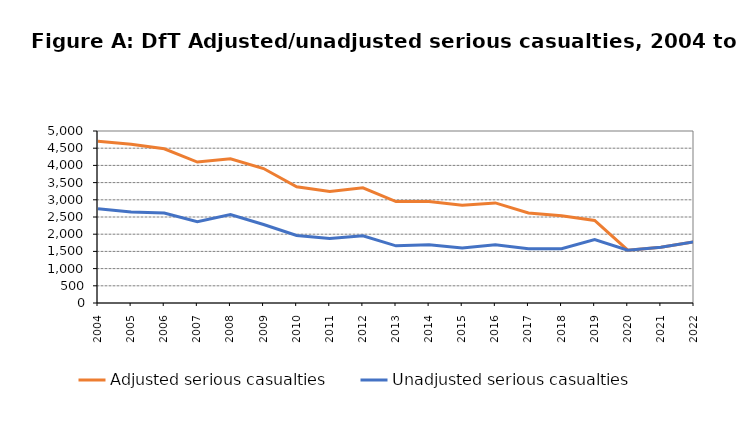
| Category | Adjusted serious casualties | Unadjusted serious casualties |
|---|---|---|
| 2004.0 | 4703 | 2741 |
| 2005.0 | 4613 | 2643 |
| 2006.0 | 4482 | 2614 |
| 2007.0 | 4097 | 2365 |
| 2008.0 | 4195 | 2572 |
| 2009.0 | 3909 | 2281 |
| 2010.0 | 3381 | 1964 |
| 2011.0 | 3244 | 1873 |
| 2012.0 | 3349 | 1956 |
| 2013.0 | 2949 | 1662 |
| 2014.0 | 2949 | 1692 |
| 2015.0 | 2840 | 1597 |
| 2016.0 | 2910 | 1693 |
| 2017.0 | 2617 | 1578 |
| 2018.0 | 2538 | 1580 |
| 2019.0 | 2401 | 1843 |
| 2020.0 | 1535 | 1535 |
| 2021.0 | 1618 | 1618 |
| 2022.0 | 1776 | 1776 |